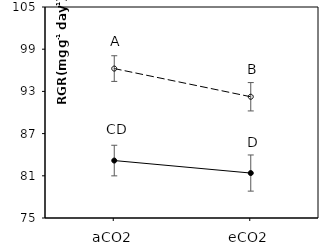
| Category | Bt | Xy |
|---|---|---|
| aCO2 | 83.168 | 96.245 |
| eCO2 | 81.39 | 92.239 |